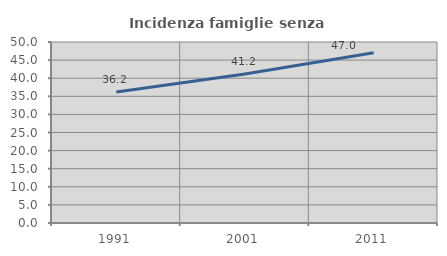
| Category | Incidenza famiglie senza nuclei |
|---|---|
| 1991.0 | 36.204 |
| 2001.0 | 41.176 |
| 2011.0 | 47.048 |